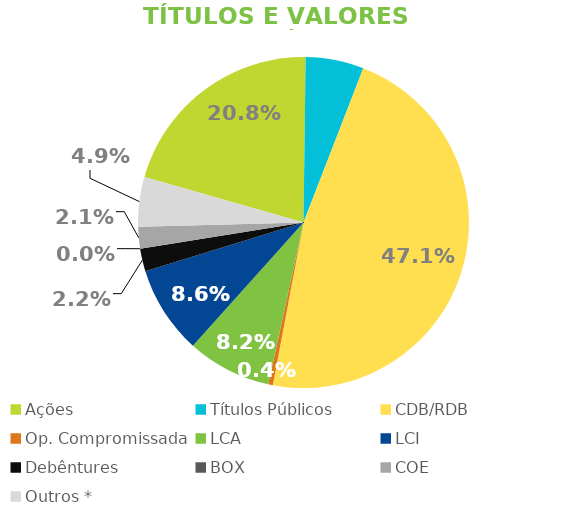
| Category | TVM |
|---|---|
| Ações | 0.208 |
| Títulos Públicos | 0.057 |
| CDB/RDB | 0.471 |
| Op. Compromissada | 0.004 |
| LCA | 0.082 |
| LCI | 0.086 |
| Debêntures | 0.022 |
| BOX | 0 |
| COE | 0.021 |
| Outros * | 0.049 |